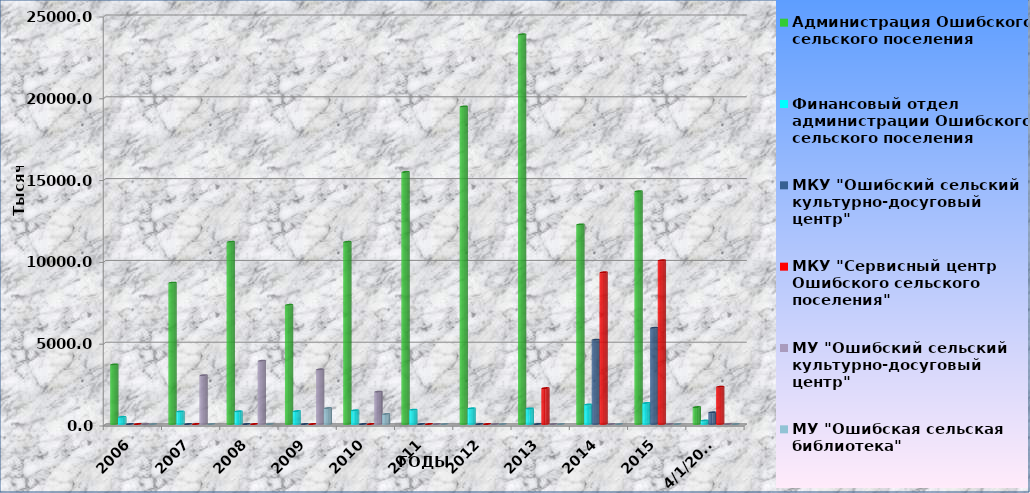
| Category | Всего расходов | в том числе: | Администрация Ошибского сельского поселения | МАУ "Ошибский сельский культурно-досуговый центр"  | МАУ "Ошибская сельская библиотека"  | Финансовый отдел администрации Ошибского сельского поселения | МКУ "Ошибский сельский культурно-досуговый центр"  | МКУ "Сервисный центр Ошибского сельского поселения" | МУ "Ошибский сельский культурно-досуговый центр" | МУ "Ошибская сельская библиотека"  |
|---|---|---|---|---|---|---|---|---|---|---|
| 2006.0 |  |  | 3637.4 |  |  | 436.3 | 0 | 0 | 0 | 0 |
| 2007.0 |  |  | 8641.3 |  |  | 770.5 | 0 | 0 | 2984.7 | 0 |
| 2008.0 |  |  | 11138.6 |  |  | 775.5 | 0 | 0 | 3866.5 | 0 |
| 2009.0 |  |  | 7285.3 |  |  | 790.8 | 0 | 0 | 3342 | 977.4 |
| 2010.0 |  |  | 11132.942 |  |  | 837.099 | 0 | 0 | 1976.914 | 615.622 |
| 2011.0 |  |  | 15408.339 |  |  | 877.032 | 0 | 0 | 0 | 0 |
| 2012.0 |  |  | 19407.82 |  |  | 959.379 | 0 | 0 | 0 | 0 |
| 2013.0 |  |  | 23820.154 |  |  | 951.375 | 0 | 2194.162 | 0 | 0 |
| 2014.0 |  |  | 12200.087 |  |  | 1192.923 | 5154.068 | 9274.466 | 0 | 0 |
| 2015.0 |  |  | 14226.5 |  |  | 1285.8 | 5882 | 10006.4 | 0 | 0 |
| 42461.0 |  |  | 1034.364 |  |  | 213.035 | 714.147 | 2280.397 | 0 | 0 |